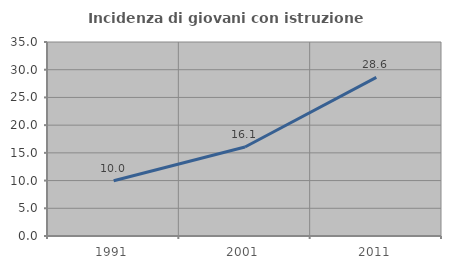
| Category | Incidenza di giovani con istruzione universitaria |
|---|---|
| 1991.0 | 9.98 |
| 2001.0 | 16.052 |
| 2011.0 | 28.614 |